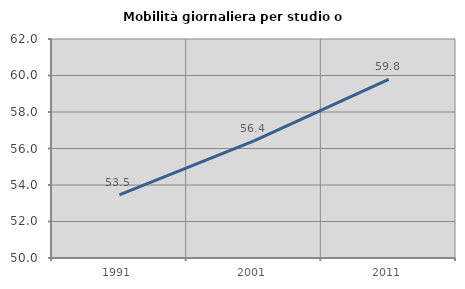
| Category | Mobilità giornaliera per studio o lavoro |
|---|---|
| 1991.0 | 53.457 |
| 2001.0 | 56.416 |
| 2011.0 | 59.786 |